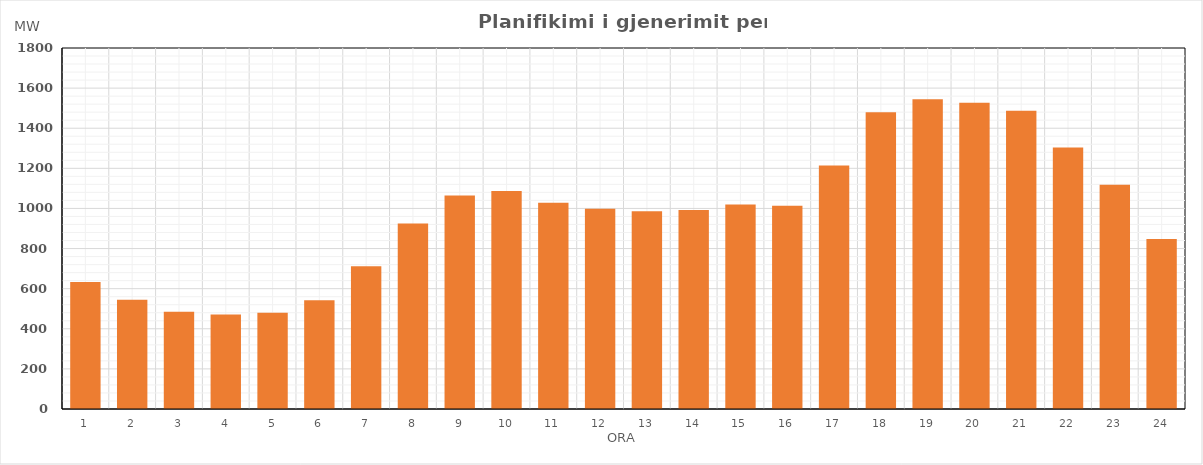
| Category | Max (MW) |
|---|---|
| 0 | 633.35 |
| 1 | 544.6 |
| 2 | 485.27 |
| 3 | 471.76 |
| 4 | 479.77 |
| 5 | 542.27 |
| 6 | 711.61 |
| 7 | 925.39 |
| 8 | 1064.22 |
| 9 | 1086.61 |
| 10 | 1028.65 |
| 11 | 998.87 |
| 12 | 985.56 |
| 13 | 992.62 |
| 14 | 1019.9 |
| 15 | 1013.25 |
| 16 | 1214.69 |
| 17 | 1480.16 |
| 18 | 1544.01 |
| 19 | 1527.18 |
| 20 | 1487.47 |
| 21 | 1303.81 |
| 22 | 1118.63 |
| 23 | 848.13 |